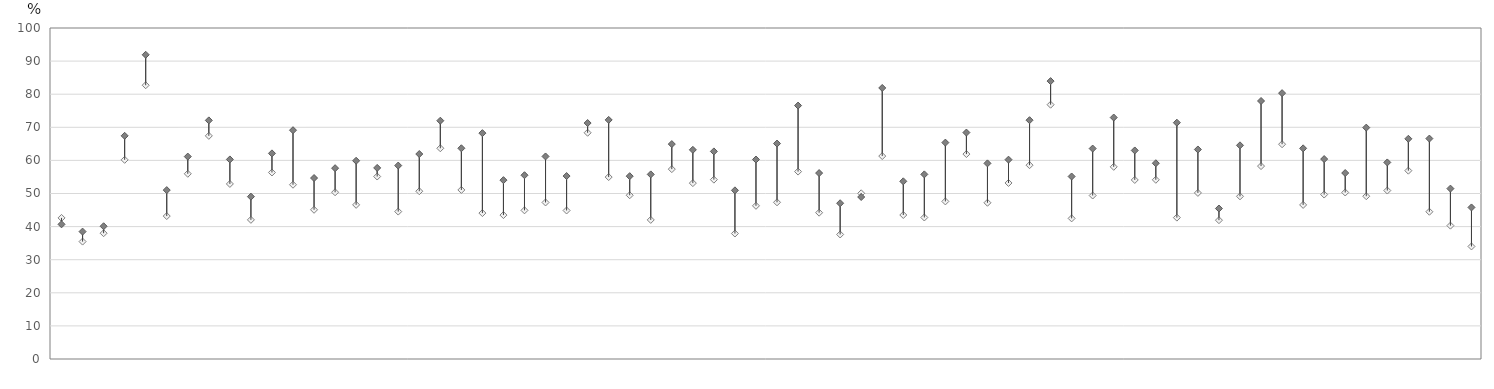
| Category | Not frequently bullied students who "sometimes" or "always" feel sad |  Frequently bullied students who "sometimes" or "always" feel sad |
|---|---|---|
| Albania | 42.624 | 40.685 |
| Kazakhstan | 35.474 | 38.494 |
| Kosovo | 38.001 | 40.105 |
| Malaysia | 60.169 | 67.428 |
| B-S-J-Z (China) | 82.708 | 91.912 |
| Montenegro | 43.181 | 51.027 |
| Thailand | 55.959 | 61.158 |
| Philippines | 67.418 | 72.088 |
| Dominican Republic | 52.893 | 60.292 |
| Bosnia and Herzegovina | 42.04 | 49.049 |
| Panama | 56.345 | 62.122 |
| Costa Rica | 52.65 | 69.122 |
| Croatia | 45.079 | 54.673 |
| Mexico | 50.375 | 57.651 |
| Serbia | 46.576 | 59.894 |
| Indonesia | 55.129 | 57.732 |
| Hungary | 44.536 | 58.441 |
| United Arab Emirates | 50.688 | 61.928 |
| Brazil | 63.662 | 71.996 |
| Peru | 51.076 | 63.663 |
| France | 44.082 | 68.234 |
| Bulgaria | 43.479 | 54.033 |
| Netherlands | 44.907 | 55.521 |
| Chinese Taipei | 47.291 | 61.189 |
| Belarus | 44.865 | 55.275 |
| Brunei Darussalam | 68.352 | 71.288 |
| Canada | 54.966 | 72.23 |
| Colombia | 49.467 | 55.232 |
| Switzerland | 42.022 | 55.771 |
| Qatar | 57.363 | 64.93 |
| Uruguay | 53.136 | 63.191 |
| Chile | 54.186 | 62.714 |
| Romania | 37.908 | 50.949 |
| Ukraine | 46.28 | 60.263 |
| Portugal | 47.335 | 65.087 |
| Ireland | 56.619 | 76.565 |
| Moldova | 44.206 | 56.173 |
| Saudi Arabia | 37.62 | 47.057 |
| Baku (Azerbaijan) | 50.057 | 48.939 |
| United States | 61.308 | 81.884 |
| Lithuania | 43.502 | 53.678 |
| Austria | 42.754 | 55.774 |
| Luxembourg | 47.609 | 65.374 |
| Malta | 61.91 | 68.41 |
| Russia | 47.201 | 59.104 |
| Morocco | 53.181 | 60.223 |
| Macao (China) | 58.555 | 72.147 |
| Hong Kong (China) | 76.829 | 83.956 |
| Germany | 42.483 | 55.136 |
| OECD average | 49.387 | 63.579 |
| Argentina | 58.057 | 72.951 |
| Slovak Republic | 54.097 | 63.002 |
| Italy | 54.143 | 59.14 |
| Iceland | 42.715 | 71.393 |
| Estonia | 50.18 | 63.299 |
| Jordan | 41.94 | 45.468 |
| Latvia | 49.147 | 64.55 |
| United Kingdom | 58.281 | 77.949 |
| Japan | 64.888 | 80.319 |
| Denmark | 46.554 | 63.64 |
| Poland | 49.681 | 60.401 |
| Greece | 50.31 | 56.183 |
| Sweden | 49.182 | 69.904 |
| Czech Republic | 50.894 | 59.381 |
| Turkey | 56.899 | 66.527 |
| Finland | 44.49 | 66.59 |
| Georgia | 40.292 | 51.48 |
| Slovenia | 34.006 | 45.786 |